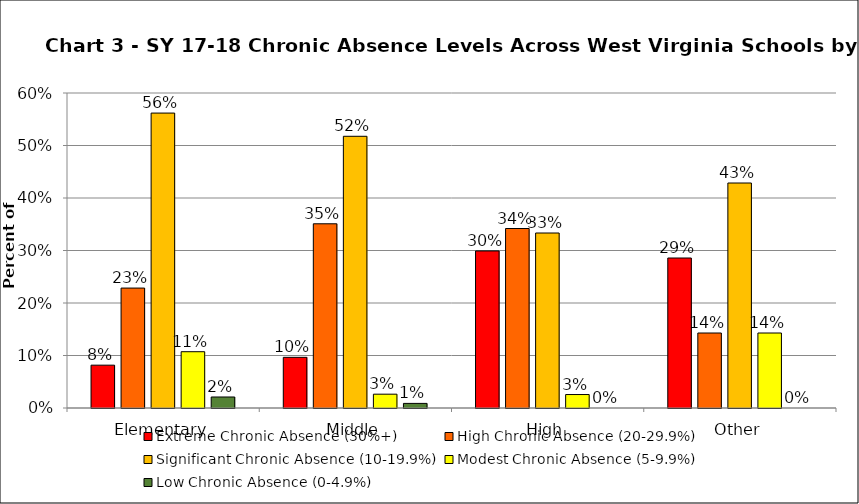
| Category | Extreme Chronic Absence (30%+) | High Chronic Absence (20-29.9%) | Significant Chronic Absence (10-19.9%) | Modest Chronic Absence (5-9.9%) | Low Chronic Absence (0-4.9%) |
|---|---|---|---|---|---|
| 0 | 0.082 | 0.228 | 0.562 | 0.107 | 0.021 |
| 1 | 0.096 | 0.351 | 0.518 | 0.026 | 0.009 |
| 2 | 0.299 | 0.342 | 0.333 | 0.026 | 0 |
| 3 | 0.286 | 0.143 | 0.429 | 0.143 | 0 |